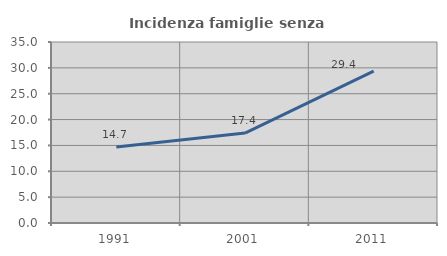
| Category | Incidenza famiglie senza nuclei |
|---|---|
| 1991.0 | 14.686 |
| 2001.0 | 17.383 |
| 2011.0 | 29.365 |